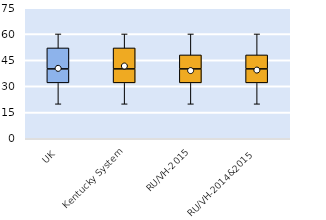
| Category | 25th | 50th | 75th |
|---|---|---|---|
| UK | 32 | 8 | 12 |
| Kentucky System | 32 | 8 | 12 |
| RU/VH-2015 | 32 | 8 | 8 |
| RU/VH-2014&2015 | 32 | 8 | 8 |